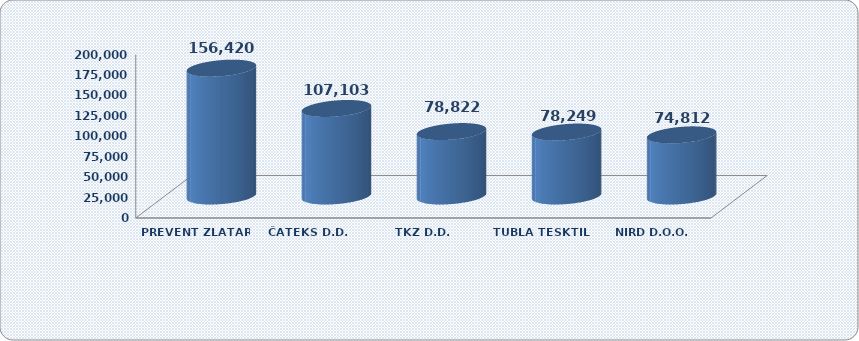
| Category | Ukupan prihod |
|---|---|
| PREVENT ZLATAR D.O.O. | 156419.979 |
| ČATEKS D.D. | 107103.469 |
| TKZ D.D. | 78821.711 |
| TUBLA TESKTIL D.O.O. | 78248.639 |
| NIRD D.O.O. | 74811.953 |